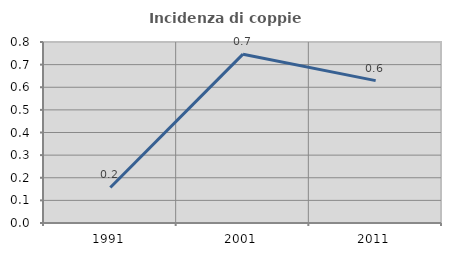
| Category | Incidenza di coppie miste |
|---|---|
| 1991.0 | 0.157 |
| 2001.0 | 0.746 |
| 2011.0 | 0.629 |